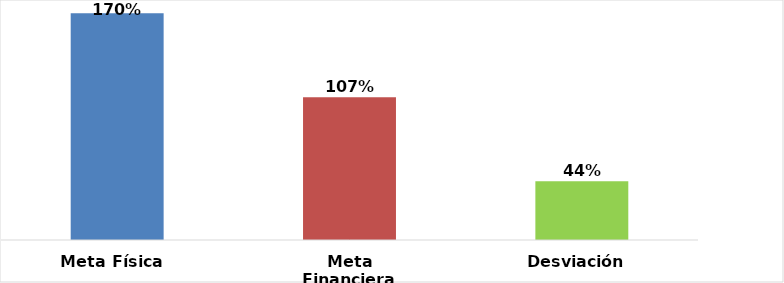
| Category | Meta Física  |
|---|---|
| Meta Física  | 1.7 |
| Meta Financiera | 1.07 |
| Desviación  | 0.44 |